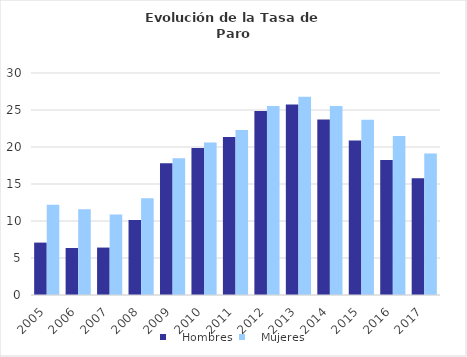
| Category |    Hombres |    Mujeres |
|---|---|---|
| 2005.0 | 7.08 | 12.2 |
| 2006.0 | 6.35 | 11.6 |
| 2007.0 | 6.41 | 10.89 |
| 2008.0 | 10.13 | 13.09 |
| 2009.0 | 17.82 | 18.49 |
| 2010.0 | 19.85 | 20.61 |
| 2011.0 | 21.34 | 22.29 |
| 2012.0 | 24.88 | 25.53 |
| 2013.0 | 25.73 | 26.79 |
| 2014.0 | 23.73 | 25.53 |
| 2015.0 | 20.893 | 23.672 |
| 2016.0 | 18.234 | 21.485 |
| 2017.0 | 15.762 | 19.131 |